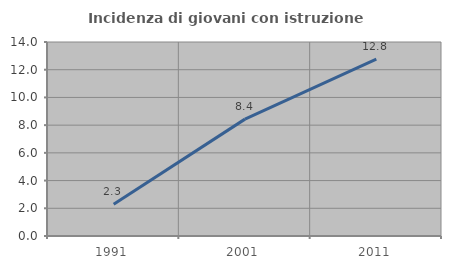
| Category | Incidenza di giovani con istruzione universitaria |
|---|---|
| 1991.0 | 2.299 |
| 2001.0 | 8.434 |
| 2011.0 | 12.766 |